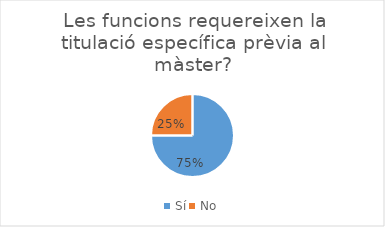
| Category | Series 0 |
|---|---|
| Sí | 6 |
| No | 2 |